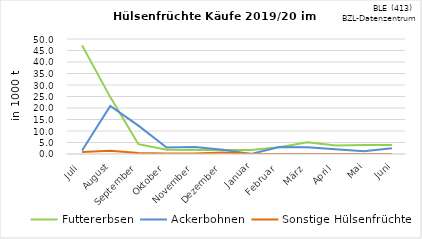
| Category | Futtererbsen | Ackerbohnen | Sonstige Hülsenfrüchte |
|---|---|---|---|
| Juli | 47.237 | 1.54 | 0.82 |
| August | 24.731 | 20.917 | 1.385 |
| September | 4.285 | 12.348 | 0.408 |
| Oktober | 1.896 | 2.859 | 0.265 |
| November | 1.786 | 3.038 | 0.2 |
| Dezember | 1.793 | 1.861 | 0.6 |
| Januar | 1.736 | 0.029 | 0.137 |
| Februar | 2.985 | 3.003 | 0 |
| März | 5.08 | 2.951 | 0 |
| April | 3.68 | 2.118 | 0 |
| Mai | 3.879 | 1.209 | 0 |
| Juni | 3.913 | 2.521 | 0 |